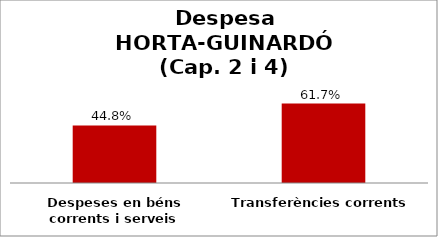
| Category | Series 0 |
|---|---|
| Despeses en béns corrents i serveis | 0.448 |
| Transferències corrents | 0.617 |